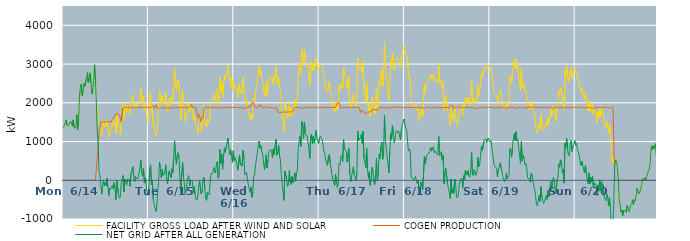
| Category | FACILITY GROSS LOAD AFTER WIND AND SOLAR | COGEN PRODUCTION | NET GRID AFTER ALL GENERATION |
|---|---|---|---|
|  Mon  6/14 | 1361 | 0 | 1361 |
|  Mon  6/14 | 1413 | 0 | 1413 |
|  Mon  6/14 | 1405 | 0 | 1405 |
|  Mon  6/14 | 1558 | 0 | 1558 |
|  Mon  6/14 | 1425 | 0 | 1425 |
|  Mon  6/14 | 1405 | 0 | 1405 |
|  Mon  6/14 | 1418 | 0 | 1418 |
|  Mon  6/14 | 1499 | 0 | 1499 |
|  Mon  6/14 | 1507 | 0 | 1507 |
|  Mon  6/14 | 1509 | 0 | 1509 |
|  Mon  6/14 | 1393 | 0 | 1393 |
|  Mon  6/14 | 1560 | 0 | 1560 |
|  Mon  6/14 | 1377 | 0 | 1377 |
|  Mon  6/14 | 1339 | 0 | 1339 |
|  Mon  6/14 | 1379 | 0 | 1379 |
|  Mon  6/14 | 1694 | 0 | 1694 |
|  Mon  6/14 | 1303 | 0 | 1303 |
|  Mon  6/14 | 1541 | 0 | 1541 |
|  Mon  6/14 | 2152 | 0 | 2152 |
|  Mon  6/14 | 2403 | 0 | 2403 |
|  Mon  6/14 | 2483 | 0 | 2483 |
|  Mon  6/14 | 2186 | 0 | 2186 |
|  Mon  6/14 | 2284 | 0 | 2284 |
|  Mon  6/14 | 2499 | 0 | 2499 |
|  Mon  6/14 | 2424 | 0 | 2424 |
|  Mon  6/14 | 2448 | 0 | 2448 |
|  Mon  6/14 | 2643 | 0 | 2643 |
|  Mon  6/14 | 2780 | 0 | 2780 |
|  Mon  6/14 | 2514 | 0 | 2514 |
|  Mon  6/14 | 2624 | 0 | 2624 |
|  Mon  6/14 | 2776 | 0 | 2776 |
|  Mon  6/14 | 2506 | 0 | 2506 |
|  Mon  6/14 | 2226 | 0 | 2226 |
|  Mon  6/14 | 2362 | 0 | 2362 |
|  Mon  6/14 | 2539 | 0 | 2539 |
|  Mon  6/14 | 2987 | 0 | 2987 |
|  Mon  6/14 | 2583 | 0 | 2583 |
|  Mon  6/14 | 1986 | 0 | 1986 |
|  Mon  6/14 | 1866 | 609 | 1257 |
|  Mon  6/14 | 1876 | 890 | 986 |
|  Mon  6/14 | 1459 | 1265 | 194 |
|  Mon  6/14 | 1480 | 1338 | 142 |
|  Mon  6/14 | 1390 | 1509 | -119 |
|  Mon  6/14 | 1164 | 1523 | -359 |
|  Mon  6/14 | 1339 | 1499 | -160 |
|  Mon  6/14 | 1508 | 1514 | -6 |
|  Mon  6/14 | 1365 | 1502 | -137 |
|  Mon  6/14 | 1443 | 1500 | -57 |
|  Mon  6/14 | 1376 | 1512 | -136 |
|  Mon  6/14 | 1571 | 1521 | 50 |
|  Mon  6/14 | 1336 | 1520 | -184 |
|  Mon  6/14 | 1119 | 1510 | -391 |
|  Mon  6/14 | 1306 | 1504 | -198 |
|  Mon  6/14 | 1273 | 1510 | -237 |
|  Mon  6/14 | 1350 | 1514 | -164 |
|  Mon  6/14 | 1458 | 1591 | -133 |
|  Mon  6/14 | 1390 | 1614 | -224 |
|  Mon  6/14 | 1557 | 1617 | -60 |
|  Mon  6/14 | 1504 | 1701 | -197 |
|  Mon  6/14 | 1200 | 1702 | -502 |
|  Mon  6/14 | 1688 | 1708 | -20 |
|  Mon  6/14 | 1668 | 1706 | -38 |
|  Mon  6/14 | 1339 | 1713 | -374 |
|  Mon  6/14 | 1246 | 1714 | -468 |
|  Mon  6/14 | 1183 | 1611 | -428 |
|  Mon  6/14 | 1444 | 1507 | -63 |
|  Mon  6/14 | 1511 | 1506 | 5 |
|  Mon  6/14 | 1994 | 1871 | 123 |
|  Mon  6/14 | 1583 | 1887 | -304 |
|  Mon  6/14 | 1931 | 1902 | 29 |
|  Mon  6/14 | 1833 | 1870 | -37 |
|  Mon  6/14 | 1742 | 1862 | -120 |
|  Mon  6/14 | 1910 | 1880 | 30 |
|  Mon  6/14 | 1933 | 1885 | 48 |
|  Mon  6/14 | 1904 | 1885 | 19 |
|  Mon  6/14 | 1712 | 1871 | -159 |
|  Mon  6/14 | 2053 | 1873 | 180 |
|  Mon  6/14 | 2071 | 1873 | 198 |
|  Mon  6/14 | 2206 | 1856 | 350 |
|  Mon  6/14 | 1973 | 1879 | 94 |
|  Mon  6/14 | 1839 | 1884 | -45 |
|  Mon  6/14 | 1987 | 1885 | 102 |
|  Mon  6/14 | 1979 | 1873 | 106 |
|  Mon  6/14 | 1899 | 1867 | 32 |
|  Mon  6/14 | 1948 | 1887 | 61 |
|  Mon  6/14 | 1948 | 1902 | 46 |
|  Mon  6/14 | 2188 | 1873 | 315 |
|  Mon  6/14 | 2384 | 1862 | 522 |
|  Mon  6/14 | 2090 | 1893 | 197 |
|  Mon  6/14 | 1990 | 1886 | 104 |
|  Mon  6/14 | 2184 | 1872 | 312 |
|  Mon  6/14 | 1816 | 1881 | -65 |
|  Mon  6/14 | 1949 | 1887 | 62 |
|  Mon  6/14 | 1783 | 1870 | -87 |
|  Mon  6/14 | 1602 | 1878 | -276 |
|  Mon  6/14 | 1501 | 1888 | -387 |
|  Tue  6/15 | 1624 | 1870 | -246 |
|  Tue  6/15 | 2158 | 1879 | 279 |
|  Tue  6/15 | 2267 | 1866 | 401 |
|  Tue  6/15 | 1742 | 1853 | -111 |
|  Tue  6/15 | 1907 | 1919 | -12 |
|  Tue  6/15 | 1422 | 1919 | -497 |
|  Tue  6/15 | 1375 | 1853 | -478 |
|  Tue  6/15 | 1185 | 1905 | -720 |
|  Tue  6/15 | 1144 | 1948 | -804 |
|  Tue  6/15 | 1220 | 1879 | -659 |
|  Tue  6/15 | 1578 | 1872 | -294 |
|  Tue  6/15 | 1837 | 1876 | -39 |
|  Tue  6/15 | 2312 | 1845 | 467 |
|  Tue  6/15 | 2183 | 1867 | 316 |
|  Tue  6/15 | 1941 | 1880 | 61 |
|  Tue  6/15 | 2162 | 1885 | 277 |
|  Tue  6/15 | 1980 | 1858 | 122 |
|  Tue  6/15 | 2017 | 1857 | 160 |
|  Tue  6/15 | 2115 | 1884 | 231 |
|  Tue  6/15 | 2258 | 1855 | 403 |
|  Tue  6/15 | 1939 | 1877 | 62 |
|  Tue  6/15 | 1783 | 1879 | -96 |
|  Tue  6/15 | 1810 | 1883 | -73 |
|  Tue  6/15 | 2086 | 1843 | 243 |
|  Tue  6/15 | 2129 | 1894 | 235 |
|  Tue  6/15 | 1951 | 1884 | 67 |
|  Tue  6/15 | 2158 | 1863 | 295 |
|  Tue  6/15 | 2064 | 1875 | 189 |
|  Tue  6/15 | 2476 | 1885 | 591 |
|  Tue  6/15 | 2900 | 1876 | 1024 |
|  Tue  6/15 | 2470 | 1869 | 601 |
|  Tue  6/15 | 2295 | 1880 | 415 |
|  Tue  6/15 | 2530 | 1886 | 644 |
|  Tue  6/15 | 2591 | 1877 | 714 |
|  Tue  6/15 | 2430 | 1859 | 571 |
|  Tue  6/15 | 1913 | 1879 | 34 |
|  Tue  6/15 | 1550 | 1882 | -332 |
|  Tue  6/15 | 2089 | 1877 | 212 |
|  Tue  6/15 | 2338 | 1877 | 461 |
|  Tue  6/15 | 1956 | 1870 | 86 |
|  Tue  6/15 | 1779 | 1881 | -102 |
|  Tue  6/15 | 1511 | 1870 | -359 |
|  Tue  6/15 | 1647 | 1874 | -227 |
|  Tue  6/15 | 1830 | 1871 | -41 |
|  Tue  6/15 | 1961 | 1883 | 78 |
|  Tue  6/15 | 2011 | 1889 | 122 |
|  Tue  6/15 | 1735 | 1883 | -148 |
|  Tue  6/15 | 1878 | 1880 | -2 |
|  Tue  6/15 | 1948 | 1954 | -6 |
|  Tue  6/15 | 1866 | 1877 | -11 |
|  Tue  6/15 | 1558 | 1870 | -312 |
|  Tue  6/15 | 1724 | 1886 | -162 |
|  Tue  6/15 | 1509 | 1880 | -371 |
|  Tue  6/15 | 1392 | 1874 | -482 |
|  Tue  6/15 | 1348 | 1866 | -518 |
|  Tue  6/15 | 1183 | 1616 | -433 |
|  Tue  6/15 | 1399 | 1602 | -203 |
|  Tue  6/15 | 1695 | 1710 | -15 |
|  Tue  6/15 | 1502 | 1512 | -10 |
|  Tue  6/15 | 1250 | 1603 | -353 |
|  Tue  6/15 | 1334 | 1610 | -276 |
|  Tue  6/15 | 1624 | 1607 | 17 |
|  Tue  6/15 | 1943 | 1870 | 73 |
|  Tue  6/15 | 1663 | 1891 | -228 |
|  Tue  6/15 | 1430 | 1891 | -461 |
|  Tue  6/15 | 1364 | 1880 | -516 |
|  Tue  6/15 | 1569 | 1875 | -306 |
|  Tue  6/15 | 1536 | 1878 | -342 |
|  Tue  6/15 | 1488 | 1866 | -378 |
|  Tue  6/15 | 1831 | 1874 | -43 |
|  Tue  6/15 | 2043 | 1880 | 163 |
|  Tue  6/15 | 2020 | 1879 | 141 |
|  Tue  6/15 | 2064 | 1885 | 179 |
|  Tue  6/15 | 2208 | 1881 | 327 |
|  Tue  6/15 | 2100 | 1880 | 220 |
|  Tue  6/15 | 2059 | 1871 | 188 |
|  Tue  6/15 | 2280 | 1859 | 421 |
|  Tue  6/15 | 2364 | 1879 | 485 |
|  Tue  6/15 | 1934 | 1880 | 54 |
|  Tue  6/15 | 1968 | 1871 | 97 |
|  Tue  6/15 | 2674 | 1873 | 801 |
|  Tue  6/15 | 2287 | 1852 | 435 |
|  Tue  6/15 | 2542 | 1864 | 678 |
|  Tue  6/15 | 2148 | 1860 | 288 |
|  Tue  6/15 | 2471 | 1874 | 597 |
|  Tue  6/15 | 2719 | 1882 | 837 |
|  Tue  6/15 | 2604 | 1885 | 719 |
|  Tue  6/15 | 2724 | 1867 | 857 |
|  Tue  6/15 | 2724 | 1883 | 841 |
|  Tue  6/15 | 2976 | 1888 | 1088 |
|  Tue  6/15 | 2692 | 1866 | 826 |
|  Tue  6/15 | 2560 | 1895 | 665 |
|  Tue  6/15 | 2667 | 1879 | 788 |
|  Tue  6/15 | 2498 | 1877 | 621 |
|  Tue  6/15 | 2319 | 1858 | 461 |
|  Tue  6/15 | 2642 | 1880 | 762 |
|  Wed  6/16 | 2372 | 1871 | 501 |
|  Wed  6/16 | 2458 | 1878 | 580 |
|  Wed  6/16 | 2446 | 1874 | 572 |
|  Wed  6/16 | 2307 | 1879 | 428 |
|  Wed  6/16 | 2129 | 1870 | 259 |
|  Wed  6/16 | 2119 | 1872 | 247 |
|  Wed  6/16 | 2517 | 1873 | 644 |
|  Wed  6/16 | 2275 | 1879 | 396 |
|  Wed  6/16 | 2318 | 1891 | 427 |
|  Wed  6/16 | 2229 | 1863 | 366 |
|  Wed  6/16 | 2647 | 1876 | 771 |
|  Wed  6/16 | 2434 | 1873 | 561 |
|  Wed  6/16 | 2023 | 1879 | 144 |
|  Wed  6/16 | 1987 | 1851 | 136 |
|  Wed  6/16 | 2083 | 1884 | 199 |
|  Wed  6/16 | 1895 | 1880 | 15 |
|  Wed  6/16 | 1782 | 1905 | -123 |
|  Wed  6/16 | 1669 | 1888 | -219 |
|  Wed  6/16 | 1565 | 1876 | -311 |
|  Wed  6/16 | 1707 | 1890 | -183 |
|  Wed  6/16 | 1556 | 1997 | -441 |
|  Wed  6/16 | 1686 | 1986 | -300 |
|  Wed  6/16 | 2110 | 2009 | 101 |
|  Wed  6/16 | 2030 | 1891 | 139 |
|  Wed  6/16 | 2292 | 1894 | 398 |
|  Wed  6/16 | 2397 | 1863 | 534 |
|  Wed  6/16 | 2598 | 1882 | 716 |
|  Wed  6/16 | 2757 | 1888 | 869 |
|  Wed  6/16 | 2945 | 1935 | 1010 |
|  Wed  6/16 | 2741 | 1909 | 832 |
|  Wed  6/16 | 2849 | 1950 | 899 |
|  Wed  6/16 | 2627 | 1885 | 742 |
|  Wed  6/16 | 2543 | 1884 | 659 |
|  Wed  6/16 | 2530 | 1883 | 647 |
|  Wed  6/16 | 2163 | 1894 | 269 |
|  Wed  6/16 | 2343 | 1897 | 446 |
|  Wed  6/16 | 2537 | 1880 | 657 |
|  Wed  6/16 | 2196 | 1880 | 316 |
|  Wed  6/16 | 2412 | 1897 | 515 |
|  Wed  6/16 | 2601 | 1866 | 735 |
|  Wed  6/16 | 2667 | 1876 | 791 |
|  Wed  6/16 | 2659 | 1879 | 780 |
|  Wed  6/16 | 2664 | 1885 | 779 |
|  Wed  6/16 | 2461 | 1883 | 578 |
|  Wed  6/16 | 2665 | 1856 | 809 |
|  Wed  6/16 | 2539 | 1876 | 663 |
|  Wed  6/16 | 2754 | 1865 | 889 |
|  Wed  6/16 | 2933 | 1879 | 1054 |
|  Wed  6/16 | 2513 | 1865 | 648 |
|  Wed  6/16 | 2478 | 1764 | 714 |
|  Wed  6/16 | 2656 | 1756 | 900 |
|  Wed  6/16 | 2379 | 1749 | 630 |
|  Wed  6/16 | 2300 | 1762 | 538 |
|  Wed  6/16 | 1890 | 1753 | 137 |
|  Wed  6/16 | 1679 | 1762 | -83 |
|  Wed  6/16 | 1657 | 1757 | -100 |
|  Wed  6/16 | 1248 | 1767 | -519 |
|  Wed  6/16 | 2003 | 1766 | 237 |
|  Wed  6/16 | 2008 | 1756 | 252 |
|  Wed  6/16 | 1799 | 1759 | 40 |
|  Wed  6/16 | 1606 | 1765 | -159 |
|  Wed  6/16 | 1661 | 1766 | -105 |
|  Wed  6/16 | 1999 | 1750 | 249 |
|  Wed  6/16 | 1718 | 1765 | -47 |
|  Wed  6/16 | 1651 | 1760 | -109 |
|  Wed  6/16 | 1854 | 1757 | 97 |
|  Wed  6/16 | 1725 | 1796 | -71 |
|  Wed  6/16 | 1832 | 1812 | 20 |
|  Wed  6/16 | 2068 | 1874 | 194 |
|  Wed  6/16 | 1842 | 1867 | -25 |
|  Wed  6/16 | 2098 | 1885 | 213 |
|  Wed  6/16 | 2125 | 1885 | 240 |
|  Wed  6/16 | 2693 | 1879 | 814 |
|  Wed  6/16 | 2884 | 1889 | 995 |
|  Wed  6/16 | 3009 | 1876 | 1133 |
|  Wed  6/16 | 2745 | 1879 | 866 |
|  Wed  6/16 | 3372 | 1860 | 1512 |
|  Wed  6/16 | 3282 | 1865 | 1417 |
|  Wed  6/16 | 2946 | 1866 | 1080 |
|  Wed  6/16 | 3367 | 1864 | 1503 |
|  Wed  6/16 | 3093 | 1887 | 1206 |
|  Wed  6/16 | 3056 | 1886 | 1170 |
|  Wed  6/16 | 3022 | 1879 | 1143 |
|  Wed  6/16 | 2855 | 1870 | 985 |
|  Wed  6/16 | 2685 | 1864 | 821 |
|  Wed  6/16 | 2452 | 1886 | 566 |
|  Wed  6/16 | 3002 | 1872 | 1130 |
|  Wed  6/16 | 3073 | 1889 | 1184 |
|  Wed  6/16 | 2822 | 1880 | 942 |
|  Wed  6/16 | 3009 | 1868 | 1141 |
|  Wed  6/16 | 2847 | 1888 | 959 |
|  Wed  6/16 | 2985 | 1890 | 1095 |
|  Wed  6/16 | 3153 | 1869 | 1284 |
|  Wed  6/16 | 2997 | 1881 | 1116 |
|  Wed  6/16 | 2996 | 1867 | 1129 |
|  Wed  6/16 | 2835 | 1884 | 951 |
|  Thu  6/17 | 2970 | 1874 | 1096 |
|  Thu  6/17 | 3023 | 1882 | 1141 |
|  Thu  6/17 | 3048 | 1882 | 1166 |
|  Thu  6/17 | 2918 | 1874 | 1044 |
|  Thu  6/17 | 2779 | 1875 | 904 |
|  Thu  6/17 | 2613 | 1863 | 750 |
|  Thu  6/17 | 2540 | 1868 | 672 |
|  Thu  6/17 | 2371 | 1875 | 496 |
|  Thu  6/17 | 2364 | 1882 | 482 |
|  Thu  6/17 | 2269 | 1883 | 386 |
|  Thu  6/17 | 2478 | 1883 | 595 |
|  Thu  6/17 | 2551 | 1883 | 668 |
|  Thu  6/17 | 2332 | 1880 | 452 |
|  Thu  6/17 | 2344 | 1872 | 472 |
|  Thu  6/17 | 2022 | 1876 | 146 |
|  Thu  6/17 | 1867 | 1865 | 2 |
|  Thu  6/17 | 1818 | 1881 | -63 |
|  Thu  6/17 | 1748 | 1882 | -134 |
|  Thu  6/17 | 2037 | 1889 | 148 |
|  Thu  6/17 | 1912 | 1894 | 18 |
|  Thu  6/17 | 1807 | 1995 | -188 |
|  Thu  6/17 | 1971 | 2017 | -46 |
|  Thu  6/17 | 2451 | 2010 | 441 |
|  Thu  6/17 | 2302 | 1903 | 399 |
|  Thu  6/17 | 2470 | 1861 | 609 |
|  Thu  6/17 | 2519 | 1881 | 638 |
|  Thu  6/17 | 2357 | 1876 | 481 |
|  Thu  6/17 | 2926 | 1877 | 1049 |
|  Thu  6/17 | 2711 | 1893 | 818 |
|  Thu  6/17 | 2689 | 1860 | 829 |
|  Thu  6/17 | 2627 | 1876 | 751 |
|  Thu  6/17 | 2358 | 1886 | 472 |
|  Thu  6/17 | 2584 | 1878 | 706 |
|  Thu  6/17 | 2689 | 1869 | 820 |
|  Thu  6/17 | 2052 | 1877 | 175 |
|  Thu  6/17 | 1858 | 1889 | -31 |
|  Thu  6/17 | 1973 | 1877 | 96 |
|  Thu  6/17 | 1977 | 1883 | 94 |
|  Thu  6/17 | 2225 | 1878 | 347 |
|  Thu  6/17 | 2030 | 1878 | 152 |
|  Thu  6/17 | 1943 | 1872 | 71 |
|  Thu  6/17 | 1878 | 1884 | -6 |
|  Thu  6/17 | 2064 | 1870 | 194 |
|  Thu  6/17 | 3152 | 1878 | 1274 |
|  Thu  6/17 | 2904 | 1878 | 1026 |
|  Thu  6/17 | 2913 | 1867 | 1046 |
|  Thu  6/17 | 2848 | 1747 | 1101 |
|  Thu  6/17 | 2933 | 1747 | 1186 |
|  Thu  6/17 | 2767 | 1815 | 952 |
|  Thu  6/17 | 3085 | 1814 | 1271 |
|  Thu  6/17 | 2336 | 1766 | 570 |
|  Thu  6/17 | 2244 | 1760 | 484 |
|  Thu  6/17 | 2028 | 1709 | 319 |
|  Thu  6/17 | 2528 | 1708 | 820 |
|  Thu  6/17 | 2030 | 1752 | 278 |
|  Thu  6/17 | 1802 | 1755 | 47 |
|  Thu  6/17 | 1983 | 1764 | 219 |
|  Thu  6/17 | 1646 | 1774 | -128 |
|  Thu  6/17 | 1786 | 1768 | 18 |
|  Thu  6/17 | 2146 | 1811 | 335 |
|  Thu  6/17 | 2051 | 1814 | 237 |
|  Thu  6/17 | 1795 | 1827 | -32 |
|  Thu  6/17 | 1700 | 1814 | -114 |
|  Thu  6/17 | 1955 | 1828 | 127 |
|  Thu  6/17 | 2395 | 1828 | 567 |
|  Thu  6/17 | 1801 | 1809 | -8 |
|  Thu  6/17 | 2003 | 1809 | 194 |
|  Thu  6/17 | 2561 | 1885 | 676 |
|  Thu  6/17 | 2452 | 1886 | 566 |
|  Thu  6/17 | 2742 | 1881 | 861 |
|  Thu  6/17 | 2875 | 1884 | 991 |
|  Thu  6/17 | 2407 | 1868 | 539 |
|  Thu  6/17 | 2555 | 1876 | 679 |
|  Thu  6/17 | 3559 | 1879 | 1680 |
|  Thu  6/17 | 2945 | 1892 | 1053 |
|  Thu  6/17 | 2731 | 1880 | 851 |
|  Thu  6/17 | 2496 | 1875 | 621 |
|  Thu  6/17 | 2288 | 1869 | 419 |
|  Thu  6/17 | 2066 | 1870 | 196 |
|  Thu  6/17 | 2608 | 1859 | 749 |
|  Thu  6/17 | 3078 | 1873 | 1205 |
|  Thu  6/17 | 2944 | 1886 | 1058 |
|  Thu  6/17 | 3285 | 1873 | 1412 |
|  Thu  6/17 | 3091 | 1885 | 1206 |
|  Thu  6/17 | 2838 | 1874 | 964 |
|  Thu  6/17 | 2970 | 1888 | 1082 |
|  Thu  6/17 | 3110 | 1869 | 1241 |
|  Thu  6/17 | 3167 | 1887 | 1280 |
|  Thu  6/17 | 3130 | 1894 | 1236 |
|  Thu  6/17 | 3145 | 1880 | 1265 |
|  Thu  6/17 | 3106 | 1856 | 1250 |
|  Thu  6/17 | 2913 | 1875 | 1038 |
|  Thu  6/17 | 3193 | 1890 | 1303 |
|  Thu  6/17 | 3294 | 1866 | 1428 |
|  Thu  6/17 | 3283 | 1862 | 1421 |
|  Thu  6/17 | 3466 | 1885 | 1581 |
|  Fri  6/18 | 3311 | 1888 | 1423 |
|  Fri  6/18 | 3282 | 1869 | 1413 |
|  Fri  6/18 | 3134 | 1861 | 1273 |
|  Fri  6/18 | 3184 | 1887 | 1297 |
|  Fri  6/18 | 2632 | 1877 | 755 |
|  Fri  6/18 | 2671 | 1869 | 802 |
|  Fri  6/18 | 2644 | 1870 | 774 |
|  Fri  6/18 | 1999 | 1884 | 115 |
|  Fri  6/18 | 1927 | 1881 | 46 |
|  Fri  6/18 | 1907 | 1878 | 29 |
|  Fri  6/18 | 1881 | 1882 | -1 |
|  Fri  6/18 | 1945 | 1876 | 69 |
|  Fri  6/18 | 1991 | 1887 | 104 |
|  Fri  6/18 | 1843 | 1875 | -32 |
|  Fri  6/18 | 1793 | 1878 | -85 |
|  Fri  6/18 | 1886 | 1878 | 8 |
|  Fri  6/18 | 1535 | 1883 | -348 |
|  Fri  6/18 | 1679 | 1872 | -193 |
|  Fri  6/18 | 1825 | 1874 | -49 |
|  Fri  6/18 | 1722 | 1875 | -153 |
|  Fri  6/18 | 1640 | 1890 | -250 |
|  Fri  6/18 | 1634 | 1866 | -232 |
|  Fri  6/18 | 2504 | 1878 | 626 |
|  Fri  6/18 | 2292 | 1863 | 429 |
|  Fri  6/18 | 2471 | 1880 | 591 |
|  Fri  6/18 | 2545 | 1878 | 667 |
|  Fri  6/18 | 2541 | 1874 | 667 |
|  Fri  6/18 | 2606 | 1902 | 704 |
|  Fri  6/18 | 2610 | 1868 | 742 |
|  Fri  6/18 | 2742 | 1890 | 852 |
|  Fri  6/18 | 2621 | 1869 | 752 |
|  Fri  6/18 | 2616 | 1872 | 744 |
|  Fri  6/18 | 2745 | 1878 | 867 |
|  Fri  6/18 | 2577 | 1868 | 709 |
|  Fri  6/18 | 2616 | 1858 | 758 |
|  Fri  6/18 | 2602 | 1893 | 709 |
|  Fri  6/18 | 2548 | 1859 | 689 |
|  Fri  6/18 | 2510 | 1861 | 649 |
|  Fri  6/18 | 3038 | 1906 | 1132 |
|  Fri  6/18 | 2508 | 1874 | 634 |
|  Fri  6/18 | 2544 | 1877 | 667 |
|  Fri  6/18 | 2606 | 1870 | 736 |
|  Fri  6/18 | 2403 | 1883 | 520 |
|  Fri  6/18 | 2509 | 1872 | 637 |
|  Fri  6/18 | 1788 | 1882 | -94 |
|  Fri  6/18 | 2073 | 1879 | 194 |
|  Fri  6/18 | 2183 | 1873 | 310 |
|  Fri  6/18 | 2193 | 1883 | 310 |
|  Fri  6/18 | 1774 | 1876 | -102 |
|  Fri  6/18 | 1662 | 1876 | -214 |
|  Fri  6/18 | 1559 | 1880 | -321 |
|  Fri  6/18 | 1418 | 1891 | -473 |
|  Fri  6/18 | 1914 | 1877 | 37 |
|  Fri  6/18 | 1601 | 1935 | -334 |
|  Fri  6/18 | 1635 | 1856 | -221 |
|  Fri  6/18 | 1533 | 1871 | -338 |
|  Fri  6/18 | 1893 | 1868 | 25 |
|  Fri  6/18 | 1796 | 1875 | -79 |
|  Fri  6/18 | 1466 | 1875 | -409 |
|  Fri  6/18 | 1415 | 1875 | -460 |
|  Fri  6/18 | 1493 | 1892 | -399 |
|  Fri  6/18 | 1752 | 1888 | -136 |
|  Fri  6/18 | 1890 | 1891 | -1 |
|  Fri  6/18 | 1869 | 1870 | -1 |
|  Fri  6/18 | 1926 | 1876 | 50 |
|  Fri  6/18 | 1679 | 1884 | -205 |
|  Fri  6/18 | 1983 | 1866 | 117 |
|  Fri  6/18 | 1879 | 1868 | 11 |
|  Fri  6/18 | 2138 | 1887 | 251 |
|  Fri  6/18 | 2100 | 1871 | 229 |
|  Fri  6/18 | 2014 | 1878 | 136 |
|  Fri  6/18 | 2142 | 1890 | 252 |
|  Fri  6/18 | 1998 | 1877 | 121 |
|  Fri  6/18 | 1943 | 1865 | 78 |
|  Fri  6/18 | 2138 | 1872 | 266 |
|  Fri  6/18 | 2604 | 1884 | 720 |
|  Fri  6/18 | 2030 | 1878 | 152 |
|  Fri  6/18 | 1988 | 1870 | 118 |
|  Fri  6/18 | 2129 | 1856 | 273 |
|  Fri  6/18 | 2022 | 1850 | 172 |
|  Fri  6/18 | 1986 | 1858 | 128 |
|  Fri  6/18 | 2053 | 1847 | 206 |
|  Fri  6/18 | 2457 | 1864 | 593 |
|  Fri  6/18 | 2197 | 1851 | 346 |
|  Fri  6/18 | 2279 | 1889 | 390 |
|  Fri  6/18 | 2493 | 1875 | 618 |
|  Fri  6/18 | 2750 | 1871 | 879 |
|  Fri  6/18 | 2646 | 1886 | 760 |
|  Fri  6/18 | 2658 | 1879 | 779 |
|  Fri  6/18 | 2915 | 1897 | 1018 |
|  Fri  6/18 | 2892 | 1868 | 1024 |
|  Fri  6/18 | 2932 | 1853 | 1079 |
|  Fri  6/18 | 2858 | 1876 | 982 |
|  Fri  6/18 | 2944 | 1882 | 1062 |
|  Fri  6/18 | 2978 | 1886 | 1092 |
|  Fri  6/18 | 2882 | 1882 | 1000 |
|  Sat  6/19 | 2879 | 1874 | 1005 |
|  Sat  6/19 | 2897 | 1878 | 1019 |
|  Sat  6/19 | 2686 | 1881 | 805 |
|  Sat  6/19 | 2523 | 1874 | 649 |
|  Sat  6/19 | 2298 | 1877 | 421 |
|  Sat  6/19 | 2246 | 1881 | 365 |
|  Sat  6/19 | 2231 | 1853 | 378 |
|  Sat  6/19 | 2205 | 1892 | 313 |
|  Sat  6/19 | 1958 | 1872 | 86 |
|  Sat  6/19 | 2136 | 1872 | 264 |
|  Sat  6/19 | 2213 | 1889 | 324 |
|  Sat  6/19 | 2311 | 1861 | 450 |
|  Sat  6/19 | 2352 | 1880 | 472 |
|  Sat  6/19 | 2140 | 1895 | 245 |
|  Sat  6/19 | 1974 | 1878 | 96 |
|  Sat  6/19 | 1904 | 1873 | 31 |
|  Sat  6/19 | 1832 | 1870 | -38 |
|  Sat  6/19 | 1867 | 1870 | -3 |
|  Sat  6/19 | 2046 | 1870 | 176 |
|  Sat  6/19 | 1897 | 1861 | 36 |
|  Sat  6/19 | 1932 | 1879 | 53 |
|  Sat  6/19 | 2005 | 1884 | 121 |
|  Sat  6/19 | 2705 | 1887 | 818 |
|  Sat  6/19 | 2602 | 1862 | 740 |
|  Sat  6/19 | 2498 | 1900 | 598 |
|  Sat  6/19 | 2760 | 1887 | 873 |
|  Sat  6/19 | 2957 | 1877 | 1080 |
|  Sat  6/19 | 3095 | 1881 | 1214 |
|  Sat  6/19 | 2882 | 1864 | 1018 |
|  Sat  6/19 | 3140 | 1886 | 1254 |
|  Sat  6/19 | 2870 | 1858 | 1012 |
|  Sat  6/19 | 2929 | 1883 | 1046 |
|  Sat  6/19 | 2697 | 1882 | 815 |
|  Sat  6/19 | 2675 | 1872 | 803 |
|  Sat  6/19 | 2312 | 1874 | 438 |
|  Sat  6/19 | 2887 | 1885 | 1002 |
|  Sat  6/19 | 2379 | 1881 | 498 |
|  Sat  6/19 | 2521 | 1874 | 647 |
|  Sat  6/19 | 2460 | 1861 | 599 |
|  Sat  6/19 | 2276 | 1881 | 395 |
|  Sat  6/19 | 2306 | 1873 | 433 |
|  Sat  6/19 | 2195 | 1879 | 316 |
|  Sat  6/19 | 1929 | 1870 | 59 |
|  Sat  6/19 | 1963 | 1921 | 42 |
|  Sat  6/19 | 1941 | 1902 | 39 |
|  Sat  6/19 | 1817 | 1867 | -50 |
|  Sat  6/19 | 2046 | 1864 | 182 |
|  Sat  6/19 | 2033 | 1878 | 155 |
|  Sat  6/19 | 1832 | 1873 | -41 |
|  Sat  6/19 | 1831 | 1897 | -66 |
|  Sat  6/19 | 1630 | 1880 | -250 |
|  Sat  6/19 | 1447 | 1871 | -424 |
|  Sat  6/19 | 1250 | 1872 | -622 |
|  Sat  6/19 | 1222 | 1884 | -662 |
|  Sat  6/19 | 1340 | 1861 | -521 |
|  Sat  6/19 | 1485 | 1868 | -383 |
|  Sat  6/19 | 1318 | 1861 | -543 |
|  Sat  6/19 | 1714 | 1879 | -165 |
|  Sat  6/19 | 1453 | 1881 | -428 |
|  Sat  6/19 | 1357 | 1880 | -523 |
|  Sat  6/19 | 1273 | 1871 | -598 |
|  Sat  6/19 | 1342 | 1880 | -538 |
|  Sat  6/19 | 1429 | 1885 | -456 |
|  Sat  6/19 | 1489 | 1878 | -389 |
|  Sat  6/19 | 1391 | 1891 | -500 |
|  Sat  6/19 | 1606 | 1871 | -265 |
|  Sat  6/19 | 1462 | 1881 | -419 |
|  Sat  6/19 | 1633 | 1872 | -239 |
|  Sat  6/19 | 1858 | 1873 | -15 |
|  Sat  6/19 | 1644 | 1871 | -227 |
|  Sat  6/19 | 1798 | 1876 | -78 |
|  Sat  6/19 | 1933 | 1859 | 74 |
|  Sat  6/19 | 1828 | 1879 | -51 |
|  Sat  6/19 | 1667 | 1876 | -209 |
|  Sat  6/19 | 1530 | 1875 | -345 |
|  Sat  6/19 | 1877 | 1888 | -11 |
|  Sat  6/19 | 1982 | 1903 | 79 |
|  Sat  6/19 | 2288 | 1875 | 413 |
|  Sat  6/19 | 2210 | 1872 | 338 |
|  Sat  6/19 | 2400 | 1871 | 529 |
|  Sat  6/19 | 2360 | 1868 | 492 |
|  Sat  6/19 | 2085 | 1890 | 195 |
|  Sat  6/19 | 2135 | 1853 | 282 |
|  Sat  6/19 | 1811 | 1886 | -75 |
|  Sat  6/19 | 2830 | 1875 | 955 |
|  Sat  6/19 | 2740 | 1888 | 852 |
|  Sat  6/19 | 2961 | 1880 | 1081 |
|  Sat  6/19 | 2648 | 1888 | 760 |
|  Sat  6/19 | 2530 | 1900 | 630 |
|  Sat  6/19 | 2543 | 1872 | 671 |
|  Sat  6/19 | 2829 | 1858 | 971 |
|  Sat  6/19 | 2901 | 1878 | 1023 |
|  Sat  6/19 | 2622 | 1879 | 743 |
|  Sat  6/19 | 2760 | 1871 | 889 |
|  Sat  6/19 | 2803 | 1877 | 926 |
|  Sat  6/19 | 2917 | 1891 | 1026 |
|  Sun  6/20 | 2788 | 1882 | 906 |
|  Sun  6/20 | 2829 | 1872 | 957 |
|  Sun  6/20 | 2661 | 1873 | 788 |
|  Sun  6/20 | 2667 | 1894 | 773 |
|  Sun  6/20 | 2521 | 1858 | 663 |
|  Sun  6/20 | 2361 | 1885 | 476 |
|  Sun  6/20 | 2261 | 1881 | 380 |
|  Sun  6/20 | 2385 | 1888 | 497 |
|  Sun  6/20 | 2260 | 1882 | 378 |
|  Sun  6/20 | 2137 | 1879 | 258 |
|  Sun  6/20 | 2078 | 1880 | 198 |
|  Sun  6/20 | 2253 | 1868 | 385 |
|  Sun  6/20 | 2069 | 1884 | 185 |
|  Sun  6/20 | 1904 | 1878 | 26 |
|  Sun  6/20 | 1790 | 1876 | -86 |
|  Sun  6/20 | 2069 | 1876 | 193 |
|  Sun  6/20 | 1779 | 1877 | -98 |
|  Sun  6/20 | 1949 | 1874 | 75 |
|  Sun  6/20 | 1829 | 1875 | -46 |
|  Sun  6/20 | 1950 | 1844 | 106 |
|  Sun  6/20 | 1686 | 1869 | -183 |
|  Sun  6/20 | 1813 | 1881 | -68 |
|  Sun  6/20 | 1784 | 1877 | -93 |
|  Sun  6/20 | 1757 | 1869 | -112 |
|  Sun  6/20 | 1482 | 1878 | -396 |
|  Sun  6/20 | 1770 | 1891 | -121 |
|  Sun  6/20 | 1604 | 1885 | -281 |
|  Sun  6/20 | 1890 | 1880 | 10 |
|  Sun  6/20 | 1630 | 1881 | -251 |
|  Sun  6/20 | 1847 | 1876 | -29 |
|  Sun  6/20 | 1722 | 1888 | -166 |
|  Sun  6/20 | 1759 | 1876 | -117 |
|  Sun  6/20 | 1473 | 1881 | -408 |
|  Sun  6/20 | 1418 | 1898 | -480 |
|  Sun  6/20 | 1345 | 1875 | -530 |
|  Sun  6/20 | 1530 | 1882 | -352 |
|  Sun  6/20 | 1460 | 1892 | -432 |
|  Sun  6/20 | 1212 | 1874 | -662 |
|  Sun  6/20 | 1434 | 1882 | -448 |
|  Sun  6/20 | 1183 | 1864 | -681 |
|  Sun  6/20 | 864 | 1890 | -1026 |
|  Sun  6/20 | 442 | 1867 | -1425 |
|  Sun  6/20 | 604 | 1882 | -1278 |
|  Sun  6/20 | 525 | 970 | -445 |
|  Sun  6/20 | 382 | 0 | 382 |
|  Sun  6/20 | 524 | 0 | 524 |
|  Sun  6/20 | 470 | 0 | 470 |
|  Sun  6/20 | 322 | 0 | 322 |
|  Sun  6/20 | 22 | 0 | 22 |
|  Sun  6/20 | -488 | 0 | -488 |
|  Sun  6/20 | -641 | 0 | -641 |
|  Sun  6/20 | -826 | 0 | -826 |
|  Sun  6/20 | -766 | 0 | -766 |
|  Sun  6/20 | -913 | 0 | -913 |
|  Sun  6/20 | -775 | 0 | -775 |
|  Sun  6/20 | -784 | 0 | -784 |
|  Sun  6/20 | -778 | 0 | -778 |
|  Sun  6/20 | -833 | 0 | -833 |
|  Sun  6/20 | -648 | 0 | -648 |
|  Sun  6/20 | -718 | 0 | -718 |
|  Sun  6/20 | -816 | 0 | -816 |
|  Sun  6/20 | -748 | 0 | -748 |
|  Sun  6/20 | -647 | 0 | -647 |
|  Sun  6/20 | -608 | 0 | -608 |
|  Sun  6/20 | -504 | 0 | -504 |
|  Sun  6/20 | -626 | 0 | -626 |
|  Sun  6/20 | -505 | 0 | -505 |
|  Sun  6/20 | -533 | 0 | -533 |
|  Sun  6/20 | -401 | 0 | -401 |
|  Sun  6/20 | -206 | 0 | -206 |
|  Sun  6/20 | -269 | 0 | -269 |
|  Sun  6/20 | -348 | 0 | -348 |
|  Sun  6/20 | -301 | 0 | -301 |
|  Sun  6/20 | -264 | 0 | -264 |
|  Sun  6/20 | -135 | 0 | -135 |
|  Sun  6/20 | -141 | 0 | -141 |
|  Sun  6/20 | 54 | 0 | 54 |
|  Sun  6/20 | 13 | 0 | 13 |
|  Sun  6/20 | 67 | 0 | 67 |
|  Sun  6/20 | 11 | 0 | 11 |
|  Sun  6/20 | 104 | 0 | 104 |
|  Sun  6/20 | 186 | 0 | 186 |
|  Sun  6/20 | 250 | 0 | 250 |
|  Sun  6/20 | 292 | 0 | 292 |
|  Sun  6/20 | 497 | 0 | 497 |
|  Sun  6/20 | 868 | 0 | 868 |
|  Sun  6/20 | 789 | 0 | 789 |
|  Sun  6/20 | 894 | 0 | 894 |
|  Sun  6/20 | 812 | 0 | 812 |
|  Sun  6/20 | 897 | 0 | 897 |
|  Sun  6/20 | 945 | 0 | 945 |
|  Sun  6/20 | 565 | 0 | 565 |